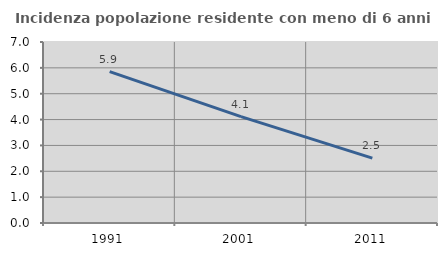
| Category | Incidenza popolazione residente con meno di 6 anni |
|---|---|
| 1991.0 | 5.857 |
| 2001.0 | 4.112 |
| 2011.0 | 2.509 |